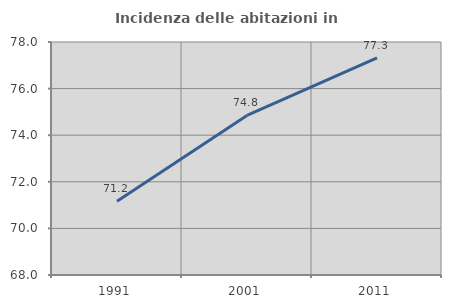
| Category | Incidenza delle abitazioni in proprietà  |
|---|---|
| 1991.0 | 71.165 |
| 2001.0 | 74.849 |
| 2011.0 | 77.314 |